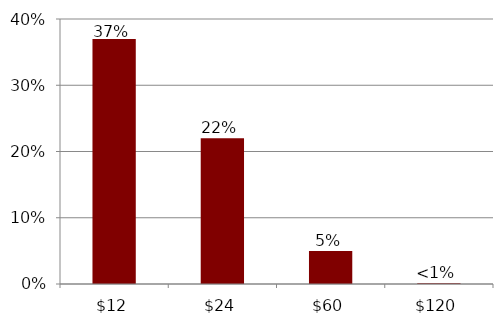
| Category | Series 0 |
|---|---|
| 12.0 | 0.37 |
| 24.0 | 0.22 |
| 60.0 | 0.05 |
| 120.0 | 0.001 |